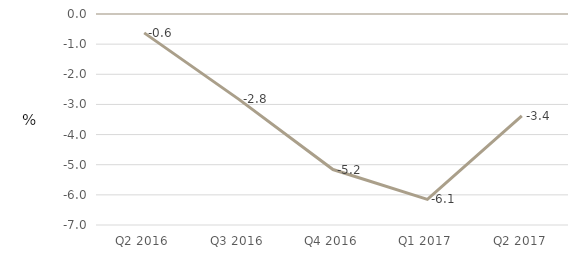
| Category | Public administration and defence;   compulsory social security |
|---|---|
| Q2 2016 | -0.626 |
| Q3 2016 | -2.823 |
| Q4 2016 | -5.16 |
| Q1 2017 | -6.15 |
| Q2 2017 | -3.383 |